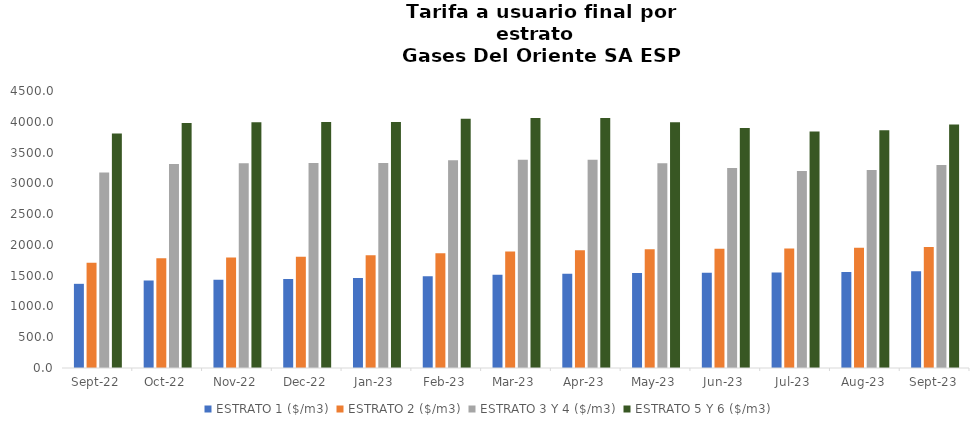
| Category | ESTRATO 1 ($/m3) | ESTRATO 2 ($/m3) | ESTRATO 3 Y 4 ($/m3) | ESTRATO 5 Y 6 ($/m3) |
|---|---|---|---|---|
| 2022-09-01 | 1367.51 | 1711.63 | 3176.14 | 3811.368 |
| 2022-10-01 | 1423.49 | 1781.6 | 3315.35 | 3978.42 |
| 2022-11-01 | 1433.79 | 1794.38 | 3327.1 | 3992.52 |
| 2022-12-01 | 1444.79 | 1808.19 | 3331.66 | 3997.992 |
| 2023-01-01 | 1462.96 | 1831 | 3330.8 | 3996.96 |
| 2023-02-01 | 1488.96 | 1863.54 | 3374.22 | 4049.064 |
| 2023-03-01 | 1513.69 | 1894.49 | 3383.42 | 4060.104 |
| 2023-04-01 | 1529.59 | 1914.39 | 3383.42 | 4060.104 |
| 2023-05-01 | 1541.54 | 1929.36 | 3326.59 | 3991.908 |
| 2023-06-01 | 1548.28 | 1937.78 | 3250.2 | 3900.24 |
| 2023-07-01 | 1551.99 | 1942.43 | 3200.63 | 3840.756 |
| 2023-08-01 | 1560.7 | 1953.33 | 3217.02 | 3860.424 |
| 2023-09-01 | 1571.61 | 1966.99 | 3297.13 | 3956.556 |